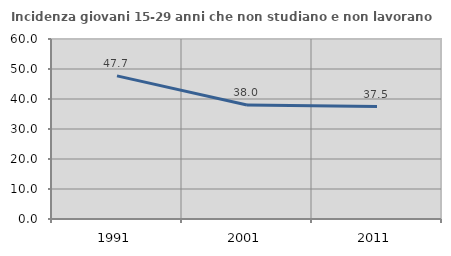
| Category | Incidenza giovani 15-29 anni che non studiano e non lavorano  |
|---|---|
| 1991.0 | 47.698 |
| 2001.0 | 38.012 |
| 2011.0 | 37.5 |